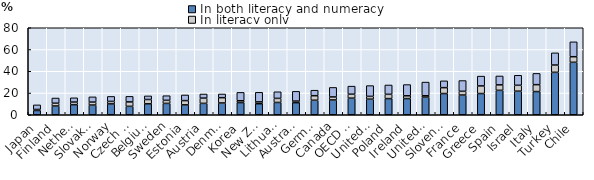
| Category | In both literacy and numeracy | In literacy only | In numeracy only |
|---|---|---|---|
| Japan | 3.932 | 0.937 | 4.218 |
| Finland | 8.051 | 2.559 | 4.781 |
| Netherlands | 9.286 | 2.391 | 3.91 |
| Slovak Republic | 8.935 | 2.692 | 4.835 |
| Norway | 9.973 | 2.286 | 4.6 |
| Czech Republic | 7.736 | 4.061 | 5.118 |
| Belgium | 10.055 | 3.972 | 3.3 |
| Sweden | 10.444 | 2.823 | 4.259 |
| Estonia | 9.095 | 3.921 | 5.2 |
| Austria | 10.462 | 4.828 | 3.803 |
| Denmark | 10.839 | 4.861 | 3.397 |
| Korea | 11.192 | 1.673 | 7.718 |
| New Zealand | 10.13 | 1.706 | 8.815 |
| Lithuania | 11.322 | 3.733 | 6.09 |
| Australia | 11.117 | 1.439 | 8.976 |
| Germany | 13.336 | 4.183 | 5.058 |
| Canada | 13.611 | 2.771 | 8.741 |
| OECD average | 15.264 | 3.603 | 7.442 |
| United Kingdom | 14.346 | 2.555 | 9.9 |
| Poland | 14.866 | 3.903 | 8.612 |
| Ireland | 14.875 | 2.567 | 10.303 |
| United States | 16.145 | 1.34 | 12.561 |
| Slovenia | 19.505 | 5.41 | 6.268 |
| France | 18.126 | 3.431 | 9.902 |
| Greece | 19.524 | 6.99 | 9.024 |
| Spain | 22.471 | 5.02 | 8.172 |
| Israel | 21.689 | 5.404 | 9.216 |
| Italy | 21.336 | 6.346 | 10.344 |
| Turkey | 39.003 | 6.723 | 11.189 |
| Chile | 48.233 | 5.13 | 13.701 |